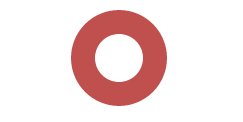
| Category | 0% 100% |
|---|---|
| 0 | 0 |
| 1 | 1 |